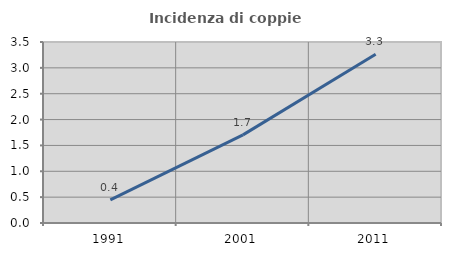
| Category | Incidenza di coppie miste |
|---|---|
| 1991.0 | 0.448 |
| 2001.0 | 1.705 |
| 2011.0 | 3.262 |